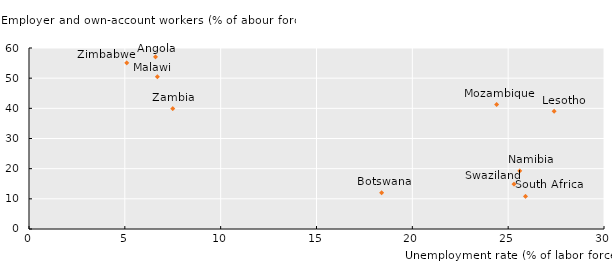
| Category | Employers and own-account workers (% of labour force) |
|---|---|
| 6.6 | 57.067 |
| 18.4 | 11.995 |
| 27.4 | 39.059 |
| 6.7 | 50.475 |
| 24.4 | 41.278 |
| 25.6 | 19.27 |
| 25.9 | 10.819 |
| 25.3 | 14.865 |
| 7.5 | 39.868 |
| 5.1 | 55.042 |